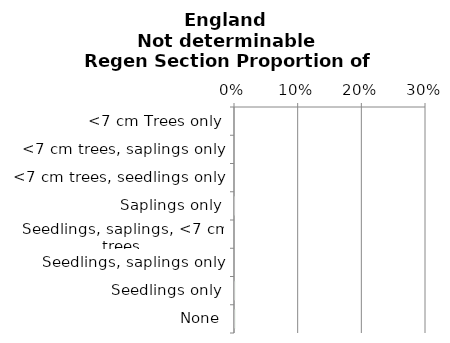
| Category | Not determinable |
|---|---|
| None | 0.001 |
| Seedlings only | 0 |
| Seedlings, saplings only | 0 |
| Seedlings, saplings, <7 cm trees | 0 |
| Saplings only | 0 |
| <7 cm trees, seedlings only | 0 |
| <7 cm trees, saplings only | 0 |
| <7 cm Trees only | 0 |